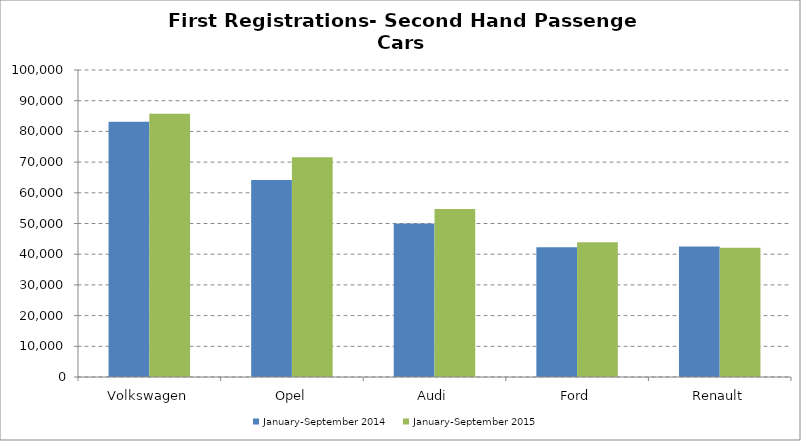
| Category | January-September 2014 | January-September 2015 |
|---|---|---|
| Volkswagen | 83154 | 85720 |
| Opel | 64179 | 71601 |
| Audi | 49991 | 54759 |
| Ford | 42263 | 43928 |
| Renault | 42484 | 42098 |